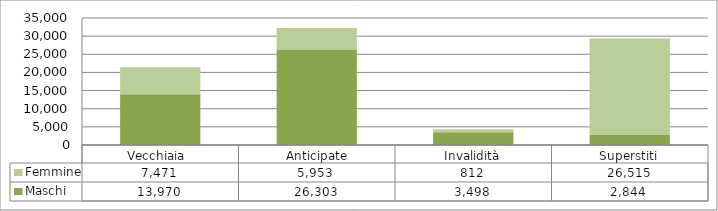
| Category | Maschi | Femmine |
|---|---|---|
| Vecchiaia  | 13970 | 7471 |
|  Anticipate | 26303 | 5953 |
| Invalidità | 3498 | 812 |
| Superstiti | 2844 | 26515 |